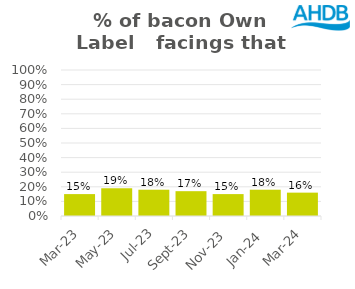
| Category | Bacon |
|---|---|
| 2023-03-01 | 0.15 |
| 2023-05-01 | 0.19 |
| 2023-07-01 | 0.18 |
| 2023-09-01 | 0.17 |
| 2023-11-01 | 0.15 |
| 2024-01-01 | 0.18 |
| 2024-03-01 | 0.16 |